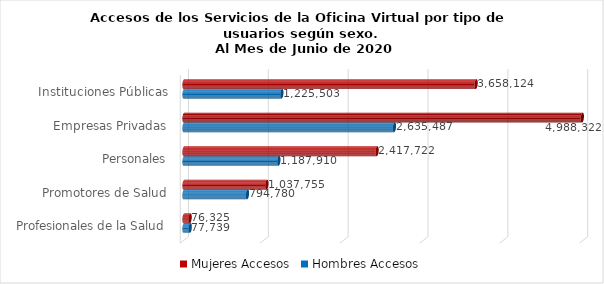
| Category | Mujeres | Hombres |
|---|---|---|
| Instituciones Públicas | 3658124 | 1225503 |
| Empresas Privadas | 4988322 | 2635487 |
| Personales | 2417722 | 1187910 |
| Promotores de Salud | 1037755 | 794780 |
| Profesionales de la Salud | 76325 | 77739 |